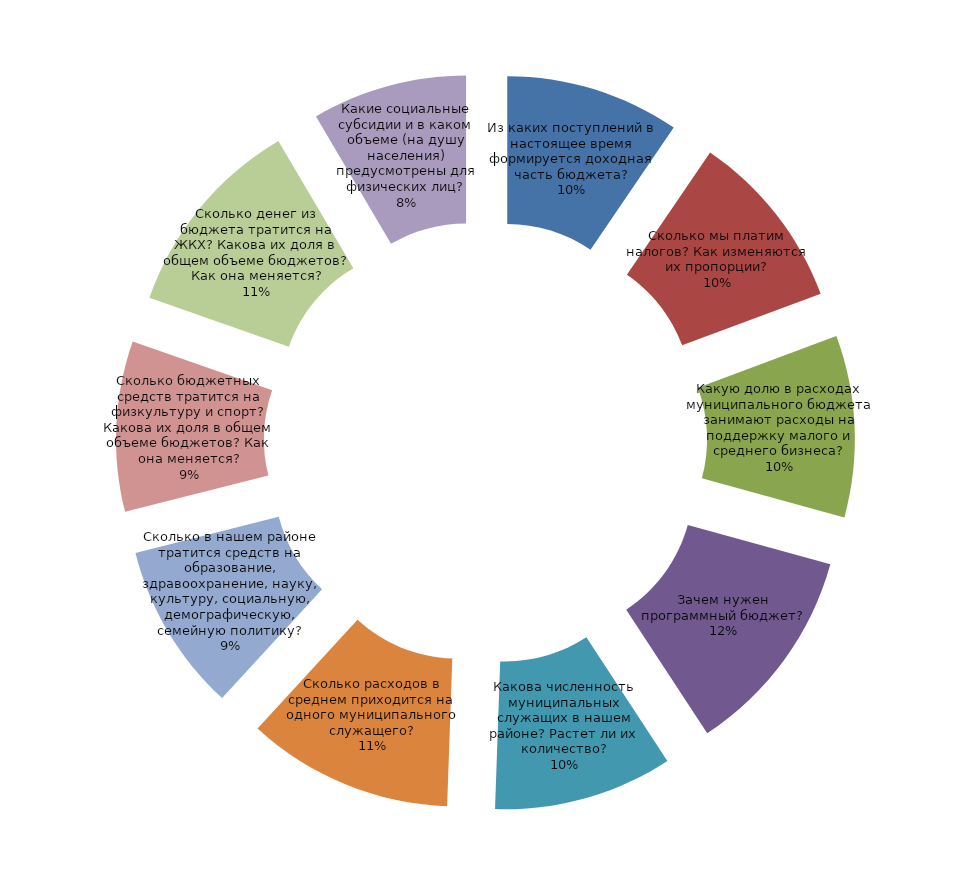
| Category | Series 0 |
|---|---|
| Из каких поступлений в настоящее время формируется доходная часть бюджета? | 4781 |
| Сколько мы платим налогов? Как изменяются их пропорции? | 4926 |
| Какую долю в расходах муниципального бюджета занимают расходы на поддержку малого и среднего бизнеса? | 4991 |
| Зачем нужен программный бюджет? | 5781 |
| Какова численность муниципальных служащих в нашем районе? Растет ли их количество? | 4916 |
| Сколько расходов в среднем приходится на одного муниципального служащего? | 5658 |
| Сколько в нашем районе тратится средств на образование, здравоохранение, науку, культуру, социальную, демографическую, семейную политику? | 4637 |
| Сколько бюджетных средств тратится на физкультуру и спорт? Какова их доля в общем объеме бюджетов? Как она меняется? | 4676 |
| Сколько денег из бюджета тратится на ЖКХ? Какова их доля в общем объеме бюджетов? Как она меняется? | 5608 |
| Какие социальные субсидии и в каком объеме (на душу населения) предусмотрены для физических лиц? | 4256 |